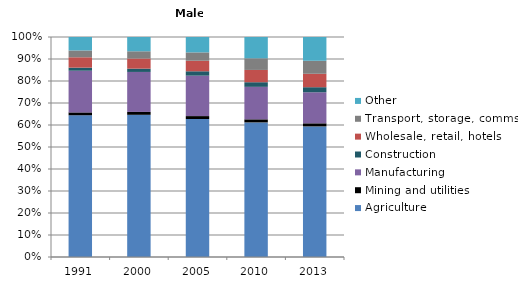
| Category | Agriculture | Mining and utilities | Manufacturing | Construction | Wholesale, retail, hotels | Transport, storage, comms | Other |
|---|---|---|---|---|---|---|---|
| 1991.0 | 64.3 | 1.3 | 18.9 | 1.4 | 4.7 | 3.1 | 6.1 |
| 2000.0 | 64.7 | 1.3 | 18.2 | 1.5 | 4.6 | 3.3 | 6.5 |
| 2005.0 | 62.8 | 1.3 | 18.4 | 2 | 4.8 | 3.8 | 7 |
| 2010.0 | 61.3 | 1.4 | 14.8 | 2.1 | 5.6 | 5.3 | 9.7 |
| 2013.0 | 59.3 | 1.4 | 14.1 | 2.3 | 6.1 | 5.9 | 10.8 |